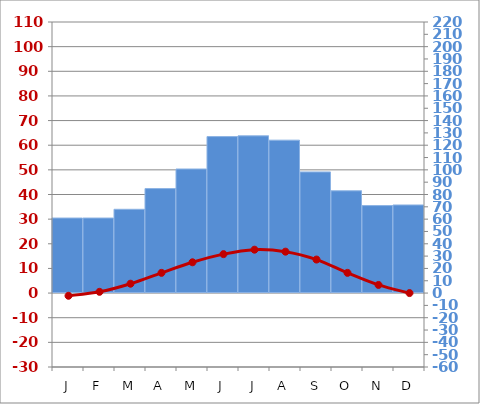
| Category | #REF! |
|---|---|
| 556 m | 60.9 |
|  | 60.9 |
| 47.38°N 8.50°E | 68 |
|  | 84.8 |
| 8.3 °C | 100.7 |
| 18.7 °C | 127 |
|  | 127.6 |
| 1077.8 mm | 124.1 |